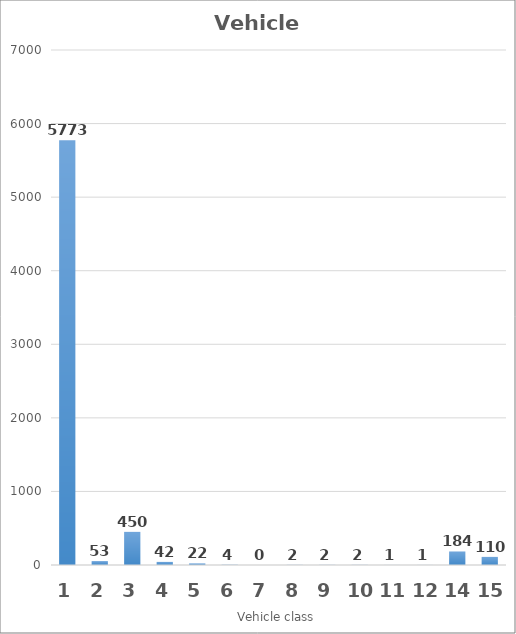
| Category | Series 0 |
|---|---|
| 1.0 | 5773 |
| 2.0 | 53 |
| 3.0 | 450 |
| 4.0 | 42 |
| 5.0 | 22 |
| 6.0 | 4 |
| 7.0 | 0 |
| 8.0 | 2 |
| 9.0 | 2 |
| 10.0 | 2 |
| 11.0 | 1 |
| 12.0 | 1 |
| 14.0 | 184 |
| 15.0 | 110 |